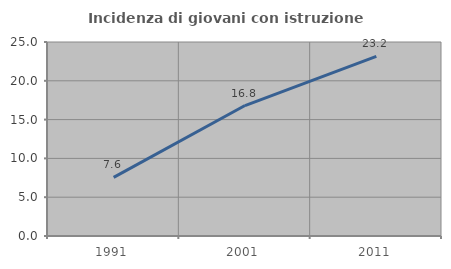
| Category | Incidenza di giovani con istruzione universitaria |
|---|---|
| 1991.0 | 7.559 |
| 2001.0 | 16.811 |
| 2011.0 | 23.158 |